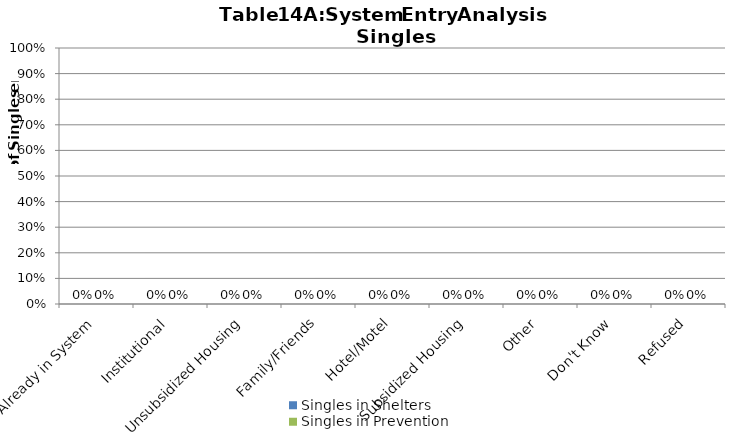
| Category | Singles in Shelters | Singles in Prevention |
|---|---|---|
| Already in System | 0 | 0 |
| Institutional | 0 | 0 |
| Unsubsidized Housing | 0 | 0 |
| Family/Friends | 0 | 0 |
| Hotel/Motel | 0 | 0 |
| Subsidized Housing | 0 | 0 |
| Other | 0 | 0 |
| Don't Know | 0 | 0 |
| Refused | 0 | 0 |